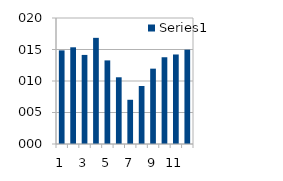
| Category | Series 0 |
|---|---|
| 0 | 14.86 |
| 1 | 15.35 |
| 2 | 14.14 |
| 3 | 16.85 |
| 4 | 13.27 |
| 5 | 10.59 |
| 6 | 7.02 |
| 7 | 9.21 |
| 8 | 11.96 |
| 9 | 13.77 |
| 10 | 14.21 |
| 11 | 14.97 |